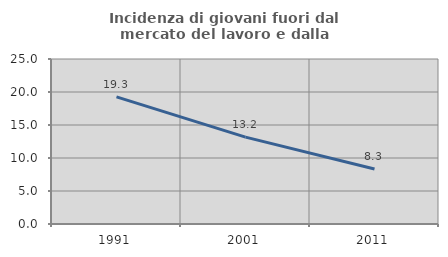
| Category | Incidenza di giovani fuori dal mercato del lavoro e dalla formazione  |
|---|---|
| 1991.0 | 19.251 |
| 2001.0 | 13.158 |
| 2011.0 | 8.333 |